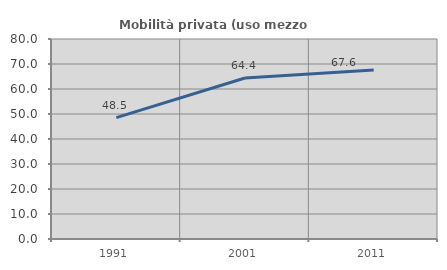
| Category | Mobilità privata (uso mezzo privato) |
|---|---|
| 1991.0 | 48.54 |
| 2001.0 | 64.383 |
| 2011.0 | 67.646 |